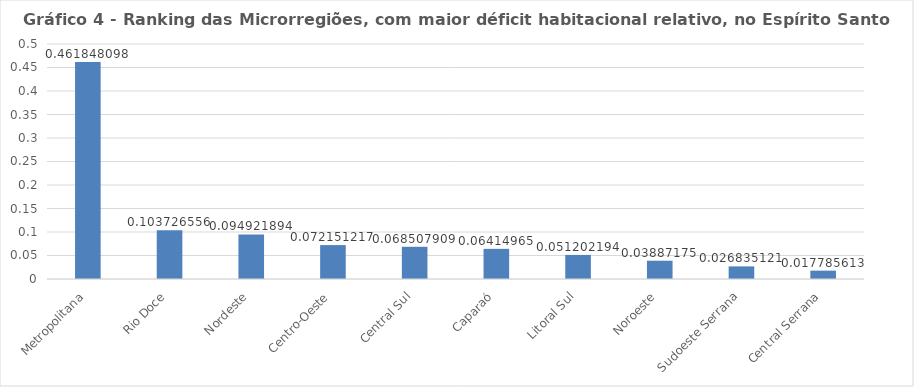
| Category | Series 0 |
|---|---|
| Metropolitana | 0.462 |
| Rio Doce | 0.104 |
| Nordeste | 0.095 |
| Centro-Oeste | 0.072 |
| Central Sul | 0.069 |
| Caparaó | 0.064 |
| Litoral Sul | 0.051 |
| Noroeste | 0.039 |
| Sudoeste Serrana | 0.027 |
| Central Serrana | 0.018 |